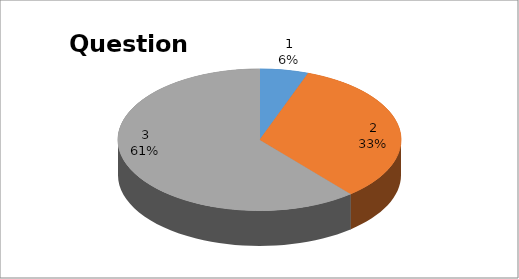
| Category | Series 0 |
|---|---|
| 0 | 3 |
| 1 | 18 |
| 2 | 33 |